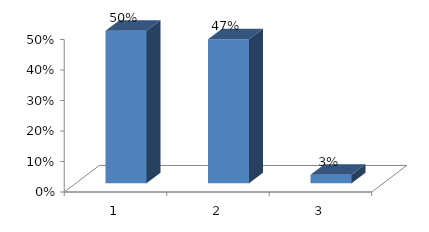
| Category | Series 0 |
|---|---|
| 0 | 0.5 |
| 1 | 0.472 |
| 2 | 0.028 |